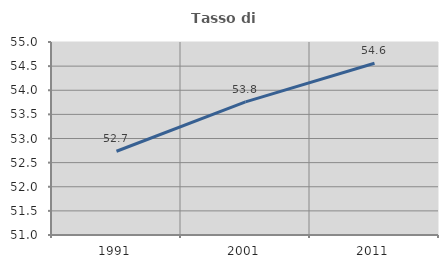
| Category | Tasso di occupazione   |
|---|---|
| 1991.0 | 52.736 |
| 2001.0 | 53.759 |
| 2011.0 | 54.56 |